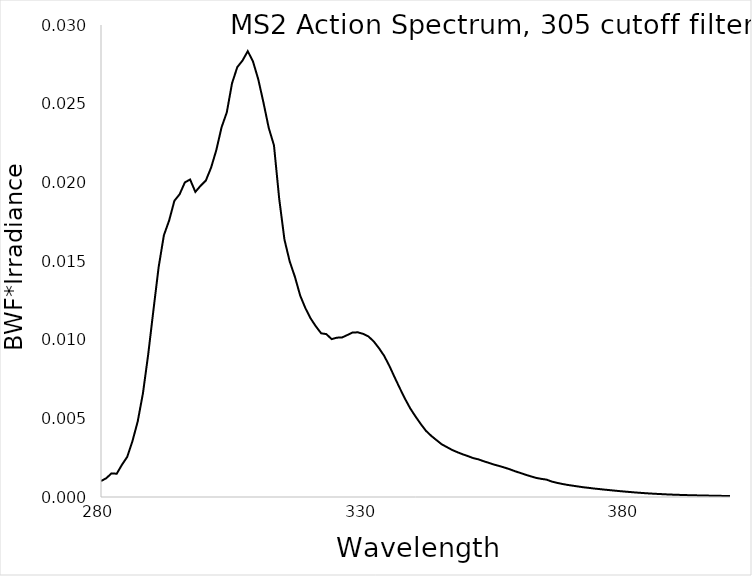
| Category | BWF |
|---|---|
| 280.0 | 0.001 |
| 281.0 | 0.001 |
| 282.0 | 0.002 |
| 283.0 | 0.001 |
| 284.0 | 0.002 |
| 285.0 | 0.003 |
| 286.0 | 0.004 |
| 287.0 | 0.005 |
| 288.0 | 0.007 |
| 289.0 | 0.009 |
| 290.0 | 0.012 |
| 291.0 | 0.015 |
| 292.0 | 0.017 |
| 293.0 | 0.018 |
| 294.0 | 0.019 |
| 295.0 | 0.019 |
| 296.0 | 0.02 |
| 297.0 | 0.02 |
| 298.0 | 0.019 |
| 299.0 | 0.02 |
| 300.0 | 0.02 |
| 301.0 | 0.021 |
| 302.0 | 0.022 |
| 303.0 | 0.023 |
| 304.0 | 0.024 |
| 305.0 | 0.026 |
| 306.0 | 0.027 |
| 307.0 | 0.028 |
| 308.0 | 0.028 |
| 309.0 | 0.028 |
| 310.0 | 0.027 |
| 311.0 | 0.025 |
| 312.0 | 0.023 |
| 313.0 | 0.022 |
| 314.0 | 0.019 |
| 315.0 | 0.016 |
| 316.0 | 0.015 |
| 317.0 | 0.014 |
| 318.0 | 0.013 |
| 319.0 | 0.012 |
| 320.0 | 0.011 |
| 321.0 | 0.011 |
| 322.0 | 0.01 |
| 323.0 | 0.01 |
| 324.0 | 0.01 |
| 325.0 | 0.01 |
| 326.0 | 0.01 |
| 327.0 | 0.01 |
| 328.0 | 0.01 |
| 329.0 | 0.01 |
| 330.0 | 0.01 |
| 331.0 | 0.01 |
| 332.0 | 0.01 |
| 333.0 | 0.009 |
| 334.0 | 0.009 |
| 335.0 | 0.008 |
| 336.0 | 0.008 |
| 337.0 | 0.007 |
| 338.0 | 0.006 |
| 339.0 | 0.006 |
| 340.0 | 0.005 |
| 341.0 | 0.005 |
| 342.0 | 0.004 |
| 343.0 | 0.004 |
| 344.0 | 0.004 |
| 345.0 | 0.003 |
| 346.0 | 0.003 |
| 347.0 | 0.003 |
| 348.0 | 0.003 |
| 349.0 | 0.003 |
| 350.0 | 0.003 |
| 351.0 | 0.002 |
| 352.0 | 0.002 |
| 353.0 | 0.002 |
| 354.0 | 0.002 |
| 355.0 | 0.002 |
| 356.0 | 0.002 |
| 357.0 | 0.002 |
| 358.0 | 0.002 |
| 359.0 | 0.002 |
| 360.0 | 0.002 |
| 361.0 | 0.001 |
| 362.0 | 0.001 |
| 363.0 | 0.001 |
| 364.0 | 0.001 |
| 365.0 | 0.001 |
| 366.0 | 0.001 |
| 367.0 | 0.001 |
| 368.0 | 0.001 |
| 369.0 | 0.001 |
| 370.0 | 0.001 |
| 371.0 | 0.001 |
| 372.0 | 0.001 |
| 373.0 | 0.001 |
| 374.0 | 0.001 |
| 375.0 | 0.001 |
| 376.0 | 0 |
| 377.0 | 0 |
| 378.0 | 0 |
| 379.0 | 0 |
| 380.0 | 0 |
| 381.0 | 0 |
| 382.0 | 0 |
| 383.0 | 0 |
| 384.0 | 0 |
| 385.0 | 0 |
| 386.0 | 0 |
| 387.0 | 0 |
| 388.0 | 0 |
| 389.0 | 0 |
| 390.0 | 0 |
| 391.0 | 0 |
| 392.0 | 0 |
| 393.0 | 0 |
| 394.0 | 0 |
| 395.0 | 0 |
| 396.0 | 0 |
| 397.0 | 0 |
| 398.0 | 0 |
| 399.0 | 0 |
| 400.0 | 0 |
| 401.0 | 0 |
| 402.0 | 0 |
| 403.0 | 0 |
| 404.0 | 0 |
| 405.0 | 0 |
| 406.0 | 0 |
| 407.0 | 0 |
| 408.0 | 0 |
| 409.0 | 0 |
| 410.0 | 0 |
| 411.0 | 0 |
| 412.0 | 0 |
| 413.0 | 0 |
| 414.0 | 0 |
| 415.0 | 0 |
| 416.0 | 0 |
| 417.0 | 0 |
| 418.0 | 0 |
| 419.0 | 0 |
| 420.0 | 0 |
| 421.0 | 0 |
| 422.0 | 0 |
| 423.0 | 0 |
| 424.0 | 0 |
| 425.0 | 0 |
| 426.0 | 0 |
| 427.0 | 0 |
| 428.0 | 0 |
| 429.0 | 0 |
| 430.0 | 0 |
| 431.0 | 0 |
| 432.0 | 0 |
| 433.0 | 0 |
| 434.0 | 0 |
| 435.0 | 0 |
| 436.0 | 0 |
| 437.0 | 0 |
| 438.0 | 0 |
| 439.0 | 0 |
| 440.0 | 0 |
| 441.0 | 0 |
| 442.0 | 0 |
| 443.0 | 0 |
| 444.0 | 0 |
| 445.0 | 0 |
| 446.0 | 0 |
| 447.0 | 0 |
| 448.0 | 0 |
| 449.0 | 0 |
| 450.0 | 0 |
| 451.0 | 0 |
| 452.0 | 0 |
| 453.0 | 0 |
| 454.0 | 0 |
| 455.0 | 0 |
| 456.0 | 0 |
| 457.0 | 0 |
| 458.0 | 0 |
| 459.0 | 0 |
| 460.0 | 0 |
| 461.0 | 0 |
| 462.0 | 0 |
| 463.0 | 0 |
| 464.0 | 0 |
| 465.0 | 0 |
| 466.0 | 0 |
| 467.0 | 0 |
| 468.0 | 0 |
| 469.0 | 0 |
| 470.0 | 0 |
| 471.0 | 0 |
| 472.0 | 0 |
| 473.0 | 0 |
| 474.0 | 0 |
| 475.0 | 0 |
| 476.0 | 0 |
| 477.0 | 0 |